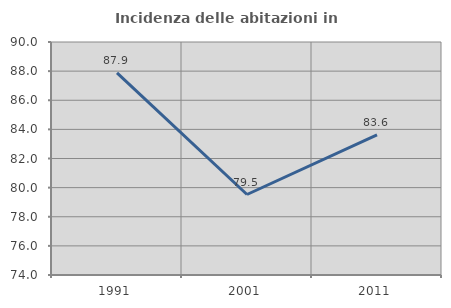
| Category | Incidenza delle abitazioni in proprietà  |
|---|---|
| 1991.0 | 87.884 |
| 2001.0 | 79.528 |
| 2011.0 | 83.628 |